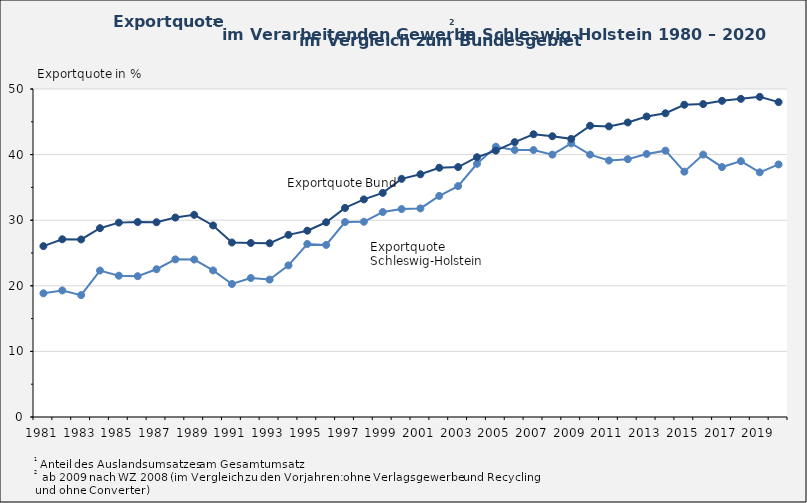
| Category | Exportquote Schleswig-Holstein | Exportquote Bund |
|---|---|---|
| 1981.0 | 18.854 | 26.048 |
| 1982.0 | 19.29 | 27.095 |
| 1983.0 | 18.582 | 27.062 |
| 1984.0 | 22.326 | 28.783 |
| 1985.0 | 21.541 | 29.631 |
| 1986.0 | 21.464 | 29.72 |
| 1987.0 | 22.528 | 29.693 |
| 1988.0 | 24.029 | 30.4 |
| 1989.0 | 24.001 | 30.816 |
| 1990.0 | 22.344 | 29.2 |
| 1991.0 | 20.275 | 26.598 |
| 1992.0 | 21.186 | 26.527 |
| 1993.0 | 20.946 | 26.489 |
| 1994.0 | 23.113 | 27.767 |
| 1995.0 | 26.377 | 28.4 |
| 1996.0 | 26.233 | 29.686 |
| 1997.0 | 29.716 | 31.871 |
| 1998.0 | 29.761 | 33.167 |
| 1999.0 | 31.245 | 34.161 |
| 2000.0 | 31.7 | 36.3 |
| 2001.0 | 31.8 | 37 |
| 2002.0 | 33.7 | 38 |
| 2003.0 | 35.2 | 38.1 |
| 2004.0 | 38.6 | 39.6 |
| 2005.0 | 41.2 | 40.6 |
| 2006.0 | 40.7 | 41.9 |
| 2007.0 | 40.7 | 43.1 |
| 2008.0 | 40 | 42.8 |
| 2009.0 | 41.7 | 42.4 |
| 2010.0 | 40 | 44.4 |
| 2011.0 | 39.1 | 44.3 |
| 2012.0 | 39.3 | 44.9 |
| 2013.0 | 40.1 | 45.8 |
| 2014.0 | 40.6 | 46.3 |
| 2015.0 | 37.4 | 47.6 |
| 2016.0 | 40 | 47.7 |
| 2017.0 | 38.1 | 48.2 |
| 2018.0 | 39 | 48.5 |
| 2019.0 | 37.3 | 48.8 |
| 2020.0 | 38.5 | 48 |